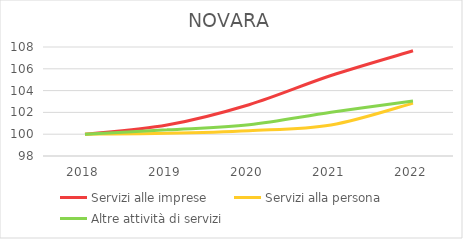
| Category | Servizi alle imprese | Servizi alla persona | Altre attività di servizi |
|---|---|---|---|
| 2018.0 | 100 | 100 | 100 |
| 2019.0 | 100.84 | 100.08 | 100.399 |
| 2020.0 | 102.706 | 100.321 | 100.868 |
| 2021.0 | 105.381 | 100.842 | 102.018 |
| 2022.0 | 107.652 | 102.847 | 103.05 |